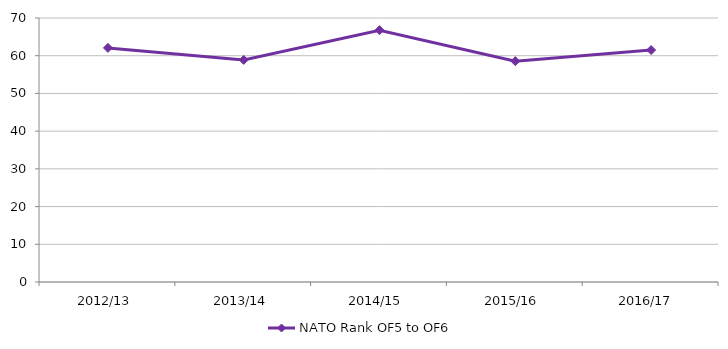
| Category | NATO Rank OF5 to OF6 |
|---|---|
| 2012/13 | 62.076 |
| 2013/14 | 58.887 |
| 2014/15 | 66.768 |
| 2015/16 | 58.565 |
| 2016/17  | 61.497 |